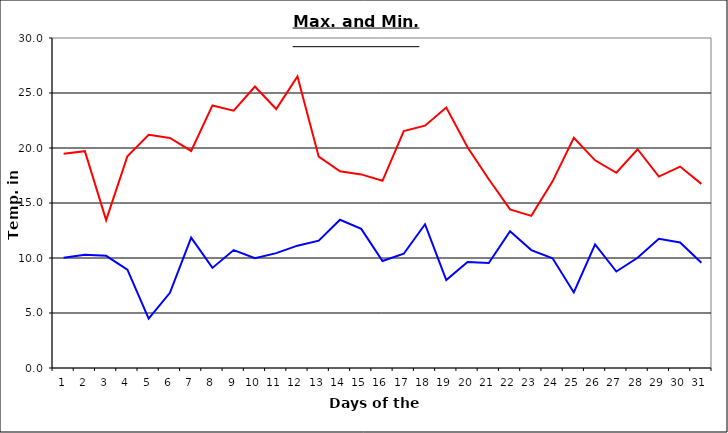
| Category | Series 0 | Series 1 |
|---|---|---|
| 0 | 19.48 | 10.02 |
| 1 | 19.71 | 10.29 |
| 2 | 13.44 | 10.2 |
| 3 | 19.25 | 8.94 |
| 4 | 21.2 | 4.48 |
| 5 | 20.91 | 6.84 |
| 6 | 19.73 | 11.85 |
| 7 | 23.87 | 9.1 |
| 8 | 23.39 | 10.72 |
| 9 | 25.59 | 9.98 |
| 10 | 23.54 | 10.44 |
| 11 | 26.5 | 11.12 |
| 12 | 19.21 | 11.58 |
| 13 | 17.88 | 13.48 |
| 14 | 17.6 | 12.65 |
| 15 | 17.02 | 9.73 |
| 16 | 21.54 | 10.39 |
| 17 | 22.03 | 13.07 |
| 18 | 23.68 | 8 |
| 19 | 20.06 | 9.63 |
| 20 | 17.16 | 9.54 |
| 21 | 14.42 | 12.43 |
| 22 | 13.83 | 10.72 |
| 23 | 16.97 | 9.97 |
| 24 | 20.93 | 6.87 |
| 25 | 18.88 | 11.24 |
| 26 | 17.75 | 8.77 |
| 27 | 19.89 | 10.02 |
| 28 | 17.4 | 11.75 |
| 29 | 18.312 | 11.41 |
| 30 | 16.74 | 9.56 |